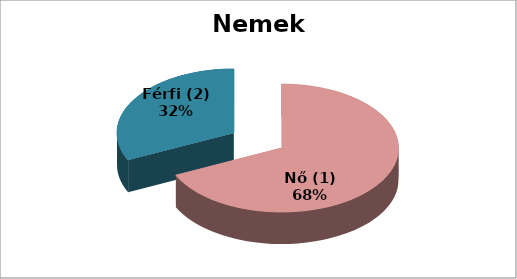
| Category | Series 0 |
|---|---|
| Nő (1) | 17 |
| Férfi (2) | 8 |